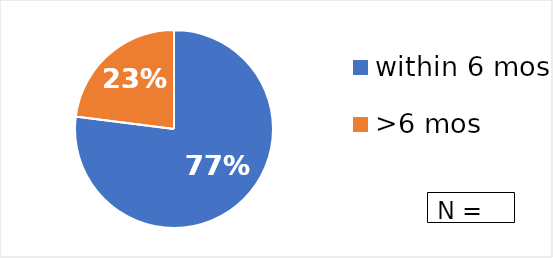
| Category | Series 0 |
|---|---|
| within 6 mos | 0.77 |
| >6 mos | 0.23 |